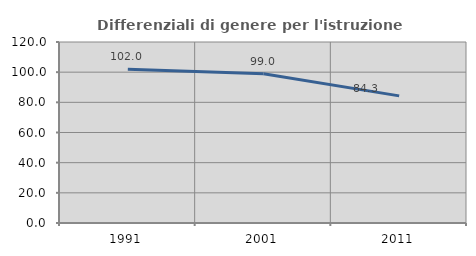
| Category | Differenziali di genere per l'istruzione superiore |
|---|---|
| 1991.0 | 101.968 |
| 2001.0 | 99.019 |
| 2011.0 | 84.28 |